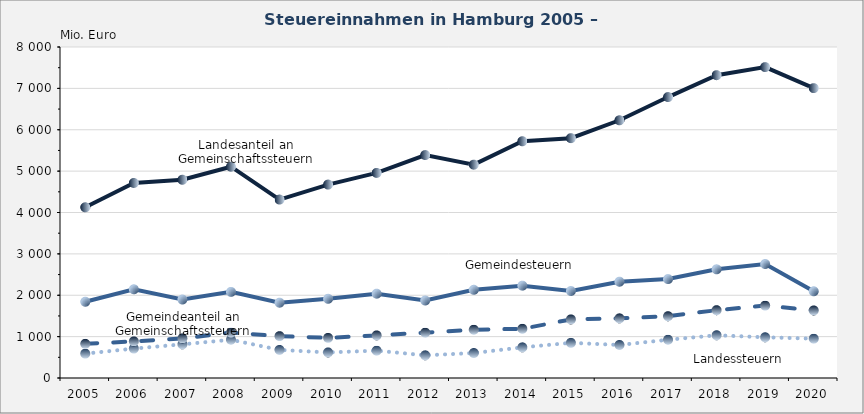
| Category | Landessteuern | Landesanteil an Gemeinschaftssteuern | Gemeindesteuern | Gemeindeanteil an Gemeinschaftssteuern |
|---|---|---|---|---|
| 2005.0 | 589 | 4126 | 1843 | 826 |
| 2006.0 | 711 | 4714 | 2144 | 885 |
| 2007.0 | 814 | 4791 | 1897 | 957 |
| 2008.0 | 925 | 5107 | 2081 | 1098 |
| 2009.0 | 679 | 4313 | 1820 | 1012 |
| 2010.0 | 618 | 4675 | 1914 | 970 |
| 2011.0 | 661 | 4957 | 2038 | 1030 |
| 2012.0 | 548 | 5388 | 1873 | 1096 |
| 2013.0 | 604 | 5156 | 2132 | 1167 |
| 2014.0 | 741 | 5722 | 2232 | 1190 |
| 2015.0 | 850 | 5797 | 2102 | 1416 |
| 2016.0 | 798 | 6229 | 2327 | 1442 |
| 2017.0 | 925 | 6790 | 2391 | 1493 |
| 2018.0 | 1033 | 7319 | 2627 | 1639 |
| 2019.0 | 984 | 7514 | 2755 | 1750 |
| 2020.0 | 951 | 7006 | 2096 | 1633 |